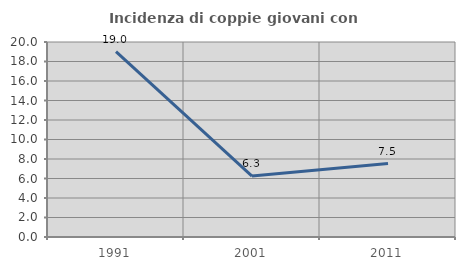
| Category | Incidenza di coppie giovani con figli |
|---|---|
| 1991.0 | 19.014 |
| 2001.0 | 6.25 |
| 2011.0 | 7.527 |